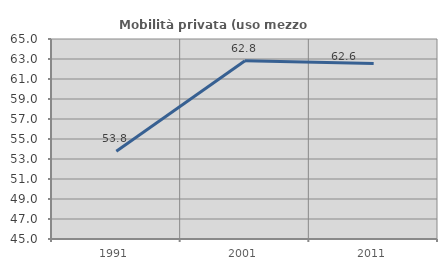
| Category | Mobilità privata (uso mezzo privato) |
|---|---|
| 1991.0 | 53.767 |
| 2001.0 | 62.829 |
| 2011.0 | 62.559 |